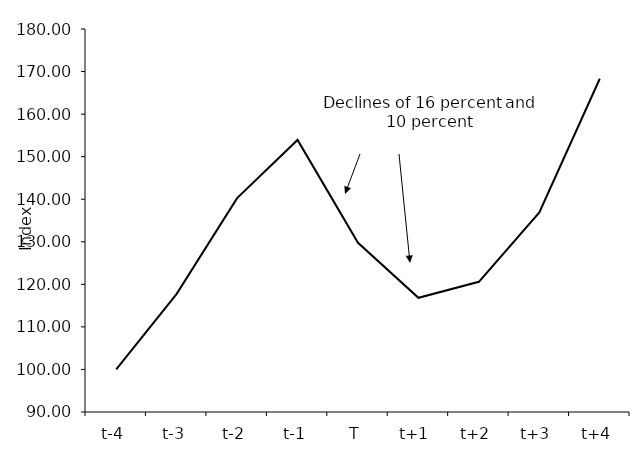
| Category | Series 0 |
|---|---|
| t-4 | 100 |
| t-3 | 117.753 |
| t-2 | 140.259 |
| t-1 | 153.933 |
| T | 129.761 |
| t+1 | 116.835 |
| t+2 | 120.594 |
| t+3 | 136.904 |
| t+4 | 168.302 |